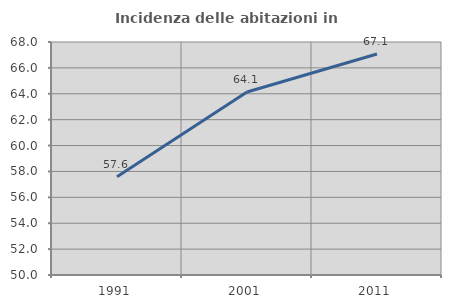
| Category | Incidenza delle abitazioni in proprietà  |
|---|---|
| 1991.0 | 57.582 |
| 2001.0 | 64.142 |
| 2011.0 | 67.077 |